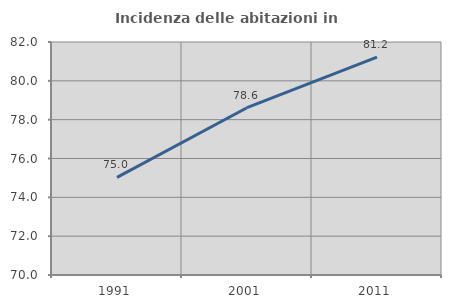
| Category | Incidenza delle abitazioni in proprietà  |
|---|---|
| 1991.0 | 75.025 |
| 2001.0 | 78.615 |
| 2011.0 | 81.222 |